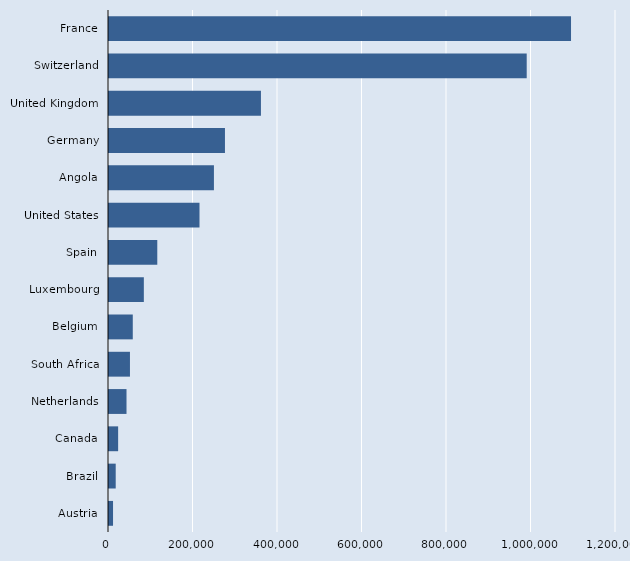
| Category | Series 2 |
|---|---|
| France | 1093540 |
| Switzerland | 988660 |
| United Kingdom | 359620 |
| Germany | 274470 |
| Angola | 248360 |
| United States | 214200 |
| Spain | 114280 |
| Luxembourg | 82470 |
| Belgium | 56280 |
| South Africa | 49600 |
| Netherlands | 41440 |
| Canada | 21610 |
| Brazil | 15890 |
| Austria | 9550 |